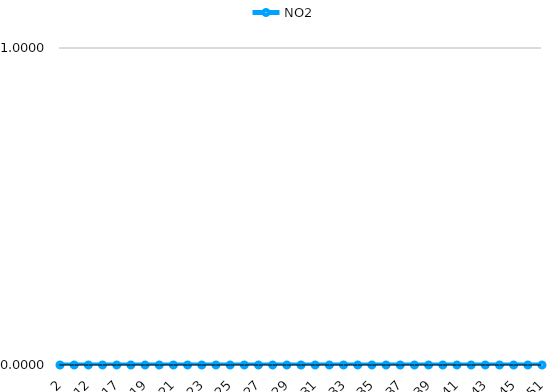
| Category | NO2 |
|---|---|
| 2 | 0 |
| 7 | 0 |
| 12 | 0 |
| 15 | 0 |
| 17 | 0 |
| 18 | 0 |
| 19 | 0 |
| 20 | 0 |
| 21 | 0 |
| 22 | 0 |
| 23 | 0 |
| 24 | 0 |
| 25 | 0 |
| 26 | 0 |
| 27 | 0 |
| 28 | 0 |
| 29 | 0 |
| 30 | 0 |
| 31 | 0 |
| 32 | 0 |
| 33 | 0 |
| 34 | 0 |
| 35 | 0 |
| 36 | 0 |
| 37 | 0 |
| 38 | 0 |
| 39 | 0 |
| 40 | 0 |
| 41 | 0 |
| 42 | 0 |
| 43 | 0 |
| 44 | 0 |
| 45 | 0 |
| 47 | 0 |
| 51 | 0 |